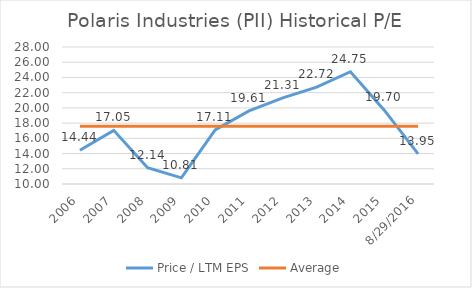
| Category | Price / LTM EPS | Average |
|---|---|---|
| 2006.0 | 14.44 | 17.599 |
| 2007.0 | 17.05 | 17.599 |
| 2008.0 | 12.14 | 17.599 |
| 2009.0 | 10.81 | 17.599 |
| 2010.0 | 17.11 | 17.599 |
| 2011.0 | 19.61 | 17.599 |
| 2012.0 | 21.31 | 17.599 |
| 2013.0 | 22.72 | 17.599 |
| 2014.0 | 24.75 | 17.599 |
| 2015.0 | 19.7 | 17.599 |
| 42611.0 | 13.95 | 17.599 |